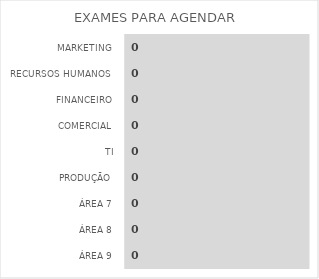
| Category | EXAMES PARA AGENDAR |
|---|---|
| MARKETING | 0 |
| RECURSOS HUMANOS | 0 |
| FINANCEIRO | 0 |
| COMERCIAL | 0 |
| TI | 0 |
| PRODUÇÃO | 0 |
| ÁREA 7 | 0 |
| ÁREA 8 | 0 |
| ÁREA 9 | 0 |